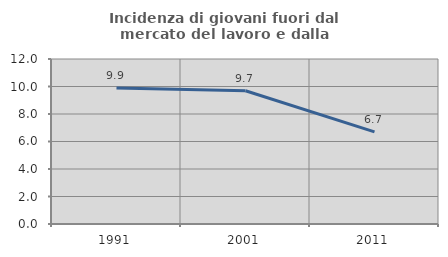
| Category | Incidenza di giovani fuori dal mercato del lavoro e dalla formazione  |
|---|---|
| 1991.0 | 9.894 |
| 2001.0 | 9.694 |
| 2011.0 | 6.701 |